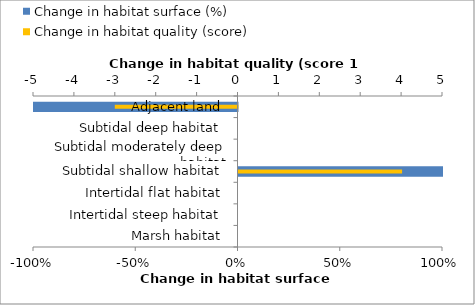
| Category | Change in habitat surface (%) |
|---|---|
| Marsh habitat | 0 |
| Intertidal steep habitat | 0 |
| Intertidal flat habitat | 0 |
| Subtidal shallow habitat | 1 |
| Subtidal moderately deep habitat | 0 |
| Subtidal deep habitat | 0 |
| Adjacent land | -1 |